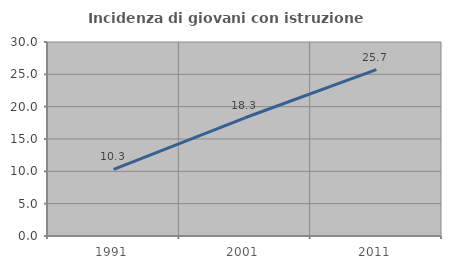
| Category | Incidenza di giovani con istruzione universitaria |
|---|---|
| 1991.0 | 10.293 |
| 2001.0 | 18.282 |
| 2011.0 | 25.733 |